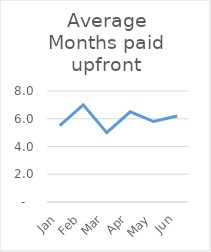
| Category | Average Months paid upfront |
|---|---|
| Jan | 5.5 |
| Feb | 7 |
| Mar | 5 |
| Apr | 6.5 |
| May | 5.8 |
| Jun | 6.2 |